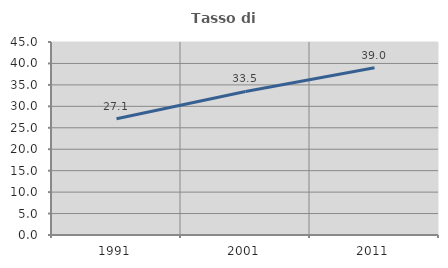
| Category | Tasso di occupazione   |
|---|---|
| 1991.0 | 27.108 |
| 2001.0 | 33.465 |
| 2011.0 | 39.004 |